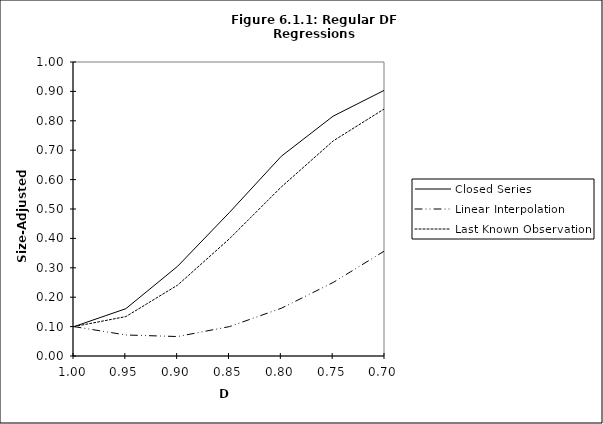
| Category | Closed Series | Linear Interpolation | Last Known Observation |
|---|---|---|---|
| 1.0 | 0.1 | 0.1 | 0.1 |
| 0.95 | 0.161 | 0.072 | 0.134 |
| 0.9 | 0.305 | 0.066 | 0.241 |
| 0.85 | 0.488 | 0.1 | 0.399 |
| 0.8 | 0.68 | 0.162 | 0.575 |
| 0.75 | 0.816 | 0.25 | 0.732 |
| 0.7 | 0.905 | 0.358 | 0.842 |